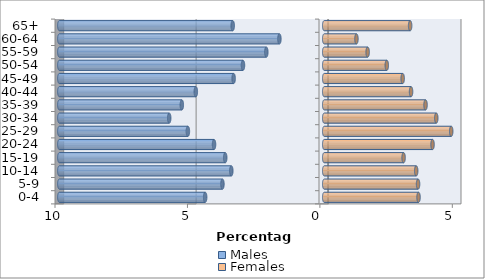
| Category | Males | Females |
|---|---|---|
| 0-4 | -4.495 | 3.561 |
| 5-9 | -3.843 | 3.543 |
| 10-14 | -3.508 | 3.473 |
| 15-19 | -3.737 | 2.997 |
| 20-24 | -4.16 | 4.09 |
| 25-29 | -5.147 | 4.795 |
| 30-34 | -5.852 | 4.231 |
| 35-39 | -5.376 | 3.825 |
| 40-44 | -4.848 | 3.279 |
| 45-49 | -3.42 | 2.961 |
| 50-54 | -3.067 | 2.362 |
| 55-59 | -2.186 | 1.639 |
| 60-64 | -1.692 | 1.216 |
| 65+ | -3.455 | 3.243 |